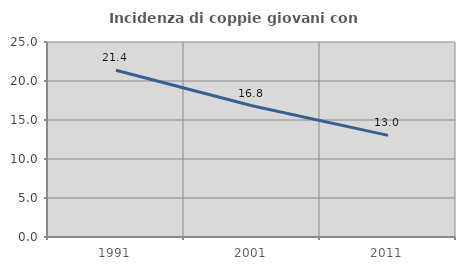
| Category | Incidenza di coppie giovani con figli |
|---|---|
| 1991.0 | 21.385 |
| 2001.0 | 16.83 |
| 2011.0 | 13.029 |